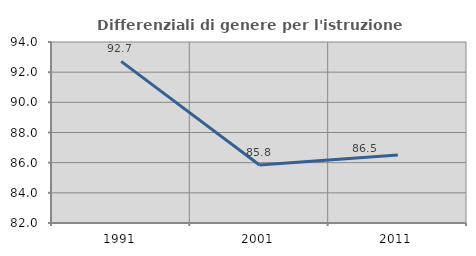
| Category | Differenziali di genere per l'istruzione superiore |
|---|---|
| 1991.0 | 92.715 |
| 2001.0 | 85.85 |
| 2011.0 | 86.501 |